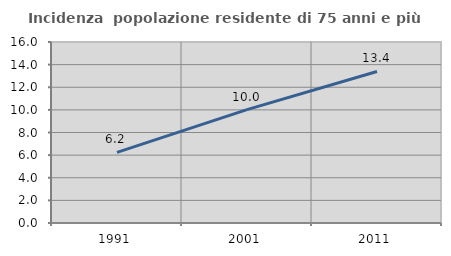
| Category | Incidenza  popolazione residente di 75 anni e più |
|---|---|
| 1991.0 | 6.239 |
| 2001.0 | 10.019 |
| 2011.0 | 13.394 |